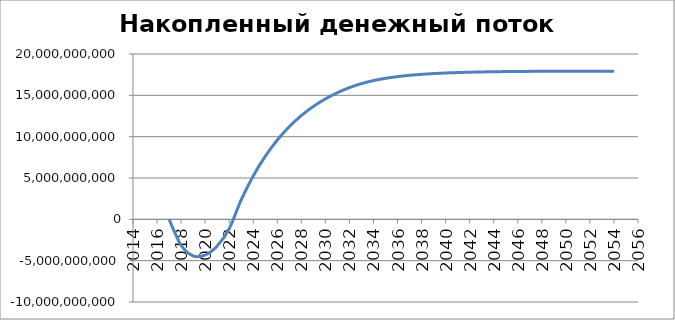
| Category | Series 0 |
|---|---|
| 2017.0 | 0 |
| 2018.0 | -3137129570 |
| 2019.0 | -4423609812 |
| 2020.0 | -4317517912 |
| 2021.0 | -3224056118 |
| 2022.0 | -1133361295 |
| 2023.0 | 2362831770 |
| 2024.0 | 5248161274 |
| 2025.0 | 7629182842 |
| 2026.0 | 9593891709 |
| 2027.0 | 11214951568 |
| 2028.0 | 12552362355 |
| 2029.0 | 13655664363 |
| 2030.0 | 14565759186 |
| 2031.0 | 15316414030 |
| 2032.0 | 15934891265 |
| 2033.0 | 16419765544 |
| 2034.0 | 16784983223 |
| 2035.0 | 17059768009 |
| 2036.0 | 17266080526 |
| 2037.0 | 17421381940 |
| 2038.0 | 17540487805 |
| 2039.0 | 17631950767 |
| 2040.0 | 17702248019 |
| 2041.0 | 17756302743 |
| 2042.0 | 17797869285 |
| 2043.0 | 17829819181 |
| 2044.0 | 17854354600 |
| 2045.0 | 17873168376 |
| 2046.0 | 17887564502 |
| 2047.0 | 17898549232 |
| 2048.0 | 17906900218 |
| 2049.0 | 17913219159 |
| 2050.0 | 17917972032 |
| 2051.0 | 17921519916 |
| 2052.0 | 17924142684 |
| 2053.0 | 17926057250 |
| 2054.0 | 17927431663 |